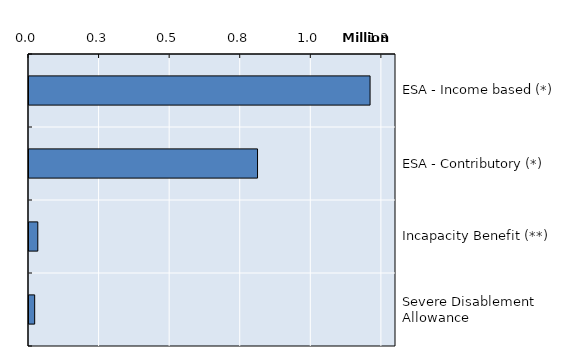
| Category | Series 0 |
|---|---|
| ESA - Income based (*) | 1208140 |
| ESA - Contributory (*) | 809560 |
| Incapacity Benefit (**) | 31170 |
| Severe Disablement Allowance | 20140 |